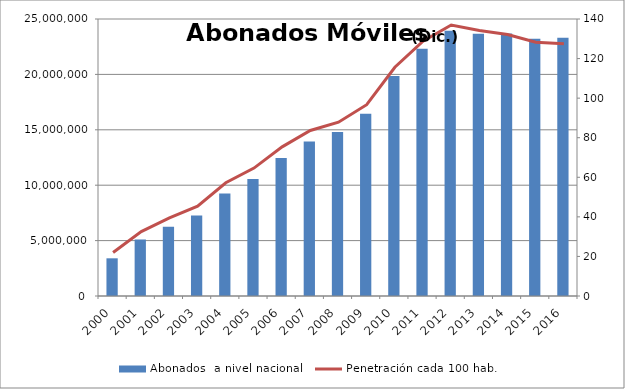
| Category | Abonados  a nivel nacional  |
|---|---|
| 2000.0 | 3401525 |
| 2001.0 | 5100783 |
| 2002.0 | 6244310 |
| 2003.0 | 7268281 |
| 2004.0 | 9261385 |
| 2005.0 | 10569572 |
| 2006.0 | 12450801 |
| 2007.0 | 13955202 |
| 2008.0 | 14796593 |
| 2009.0 | 16450223 |
| 2010.0 | 19852242 |
| 2011.0 | 22315248 |
| 2012.0 | 23940973 |
| 2013.0 | 23661339 |
| 2014.0 | 23680718 |
| 2015.0 | 23206353 |
| 2016.0 | 23302603 |